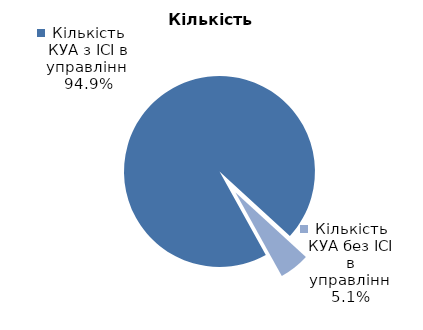
| Category | Кількість КУА з ІСІ в управлінні |
|---|---|
| Кількість КУА з ІСІ в управлінні | 277 |
| Кількість КУА без ІСІ в управлінні | 15 |